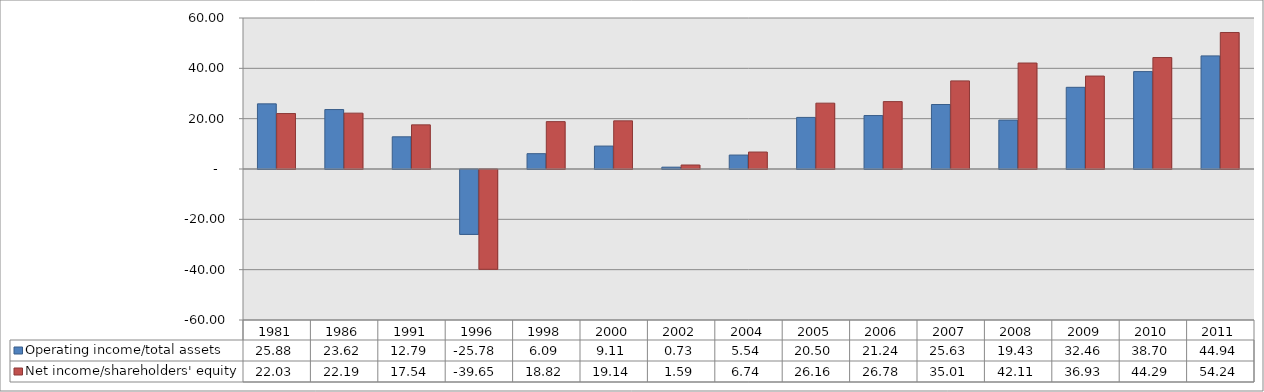
| Category | Operating income/total assets | Net income/shareholders' equity |
|---|---|---|
| 1981.0 | 25.882 | 22.034 |
| 1986.0 | 23.621 | 22.19 |
| 1991.0 | 12.793 | 17.544 |
| 1996.0 | -25.783 | -39.65 |
| 1998.0 | 6.085 | 18.819 |
| 2000.0 | 9.114 | 19.138 |
| 2002.0 | 0.73 | 1.587 |
| 2004.0 | 5.541 | 6.74 |
| 2005.0 | 20.497 | 26.162 |
| 2006.0 | 21.236 | 26.777 |
| 2007.0 | 25.626 | 35.006 |
| 2008.0 | 19.427 | 42.11 |
| 2009.0 | 32.457 | 36.933 |
| 2010.0 | 38.704 | 44.289 |
| 2011.0 | 44.944 | 54.24 |